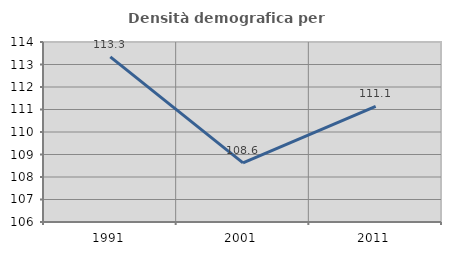
| Category | Densità demografica |
|---|---|
| 1991.0 | 113.338 |
| 2001.0 | 108.626 |
| 2011.0 | 111.143 |